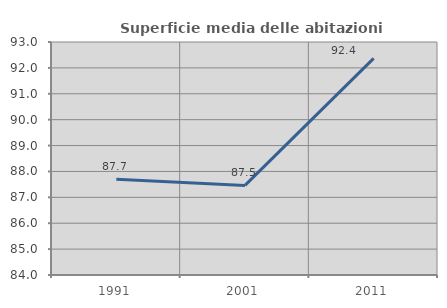
| Category | Superficie media delle abitazioni occupate |
|---|---|
| 1991.0 | 87.703 |
| 2001.0 | 87.462 |
| 2011.0 | 92.368 |